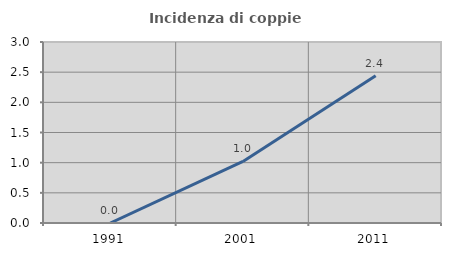
| Category | Incidenza di coppie miste |
|---|---|
| 1991.0 | 0 |
| 2001.0 | 1.02 |
| 2011.0 | 2.439 |